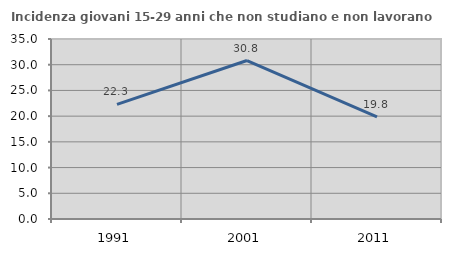
| Category | Incidenza giovani 15-29 anni che non studiano e non lavorano  |
|---|---|
| 1991.0 | 22.294 |
| 2001.0 | 30.818 |
| 2011.0 | 19.844 |